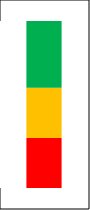
| Category | Series 0 | Series 1 | Series 2 |
|---|---|---|---|
| Summe 1 -10 | 0.3 | 0.3 | 0.4 |